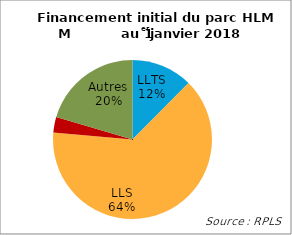
| Category | Series 0 |
|---|---|
| LLTS | 0.124 |
| LLS | 0.64 |
| PLR/PSR | 0.032 |
| Autres | 0.204 |